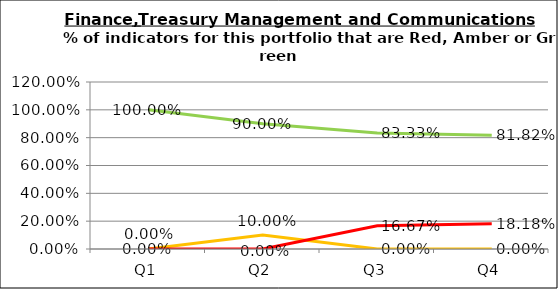
| Category | Green | Amber | Red |
|---|---|---|---|
| Q1 | 1 | 0 | 0 |
| Q2 | 0.9 | 0.1 | 0 |
| Q3 | 0.833 | 0 | 0.167 |
| Q4 | 0.818 | 0 | 0.182 |